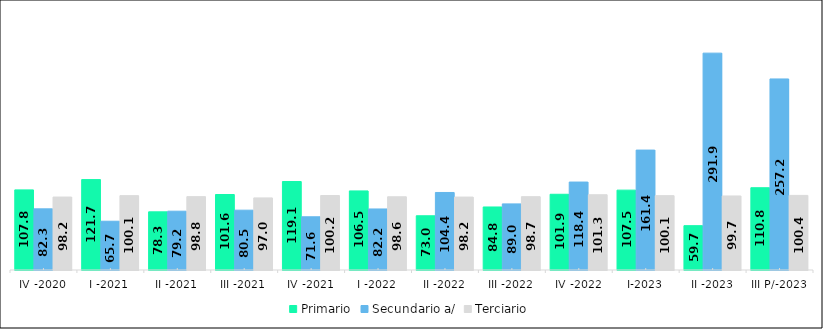
| Category |  Primario  |  Secundario a/  |  Terciario  |
|---|---|---|---|
| IV -2020 | 107.842 | 82.297 | 98.189 |
| I -2021 | 121.733 | 65.665 | 100.091 |
| II -2021 | 78.287 | 79.158 | 98.769 |
| III -2021 | 101.625 | 80.524 | 97.031 |
| IV -2021 | 119.093 | 71.632 | 100.221 |
| I -2022 | 106.451 | 82.176 | 98.576 |
| II -2022 | 73 | 104.364 | 98.151 |
| III -2022 | 84.841 | 89.001 | 98.699 |
| IV -2022 | 101.942 | 118.38 | 101.33 |
| I-2023 | 107.521 | 161.424 | 100.099 |
| II -2023 | 59.68 | 291.935 | 99.672 |
| III P/-2023 | 110.76 | 257.193 | 100.398 |